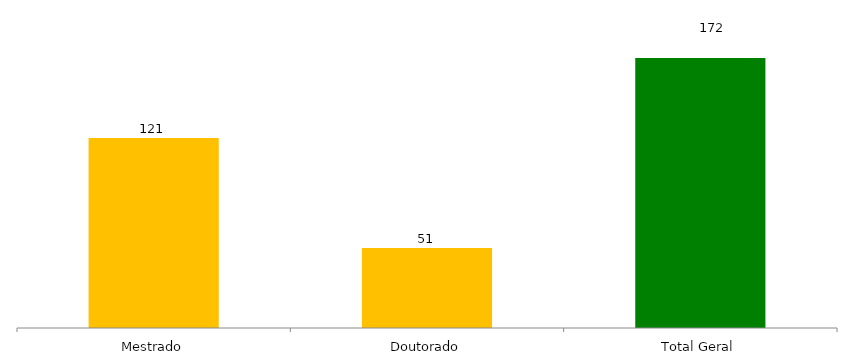
| Category | Categoria/Ano |
|---|---|
| Mestrado | 121 |
| Doutorado | 51 |
| Total Geral | 172 |